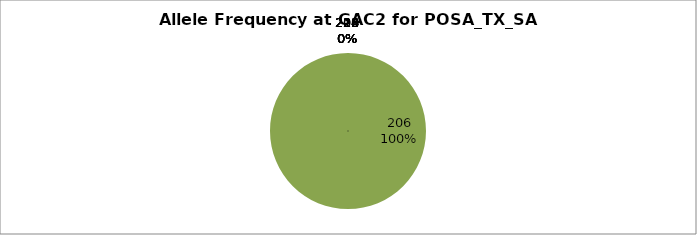
| Category | Series 0 |
|---|---|
| 204.0 | 0 |
| 205.0 | 0 |
| 206.0 | 1 |
| 209.0 | 0 |
| 216.0 | 0 |
| 218.0 | 0 |
| 220.0 | 0 |
| 222.0 | 0 |
| 224.0 | 0 |
| 226.0 | 0 |
| 228.0 | 0 |